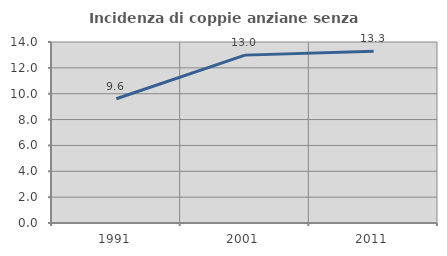
| Category | Incidenza di coppie anziane senza figli  |
|---|---|
| 1991.0 | 9.608 |
| 2001.0 | 12.985 |
| 2011.0 | 13.288 |